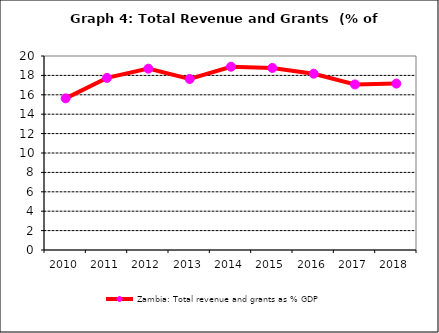
| Category | Zambia: Total revenue and grants as % GDP |
|---|---|
| 2010.0 | 15.634 |
| 2011.0 | 17.743 |
| 2012.0 | 18.694 |
| 2013.0 | 17.629 |
| 2014.0 | 18.895 |
| 2015.0 | 18.77 |
| 2016.0 | 18.176 |
| 2017.0 | 17.068 |
| 2018.0 | 17.155 |